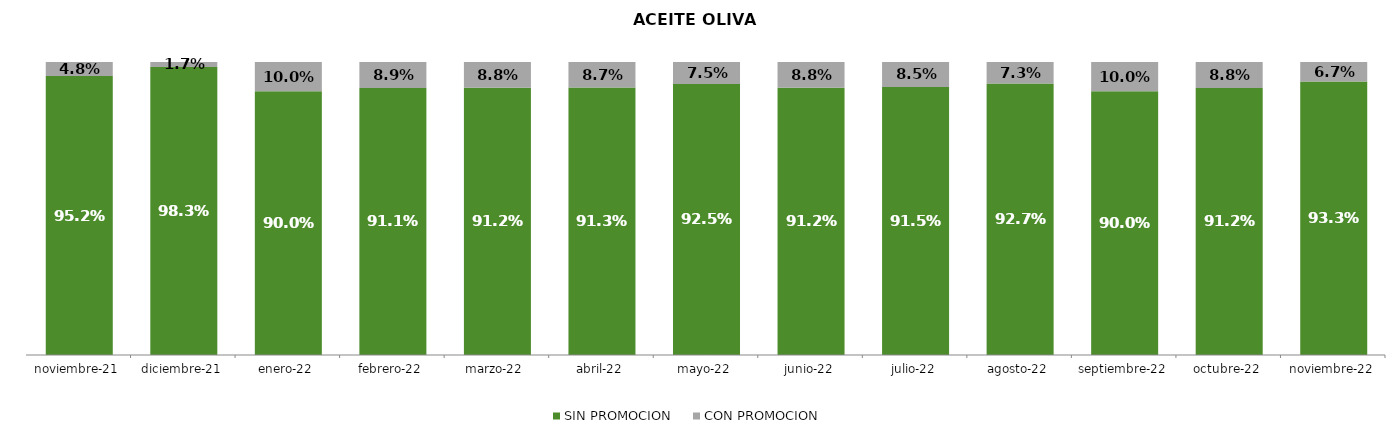
| Category | SIN PROMOCION   | CON PROMOCION   |
|---|---|---|
| 2021-11-01 | 0.952 | 0.048 |
| 2021-12-01 | 0.983 | 0.017 |
| 2022-01-01 | 0.9 | 0.1 |
| 2022-02-01 | 0.911 | 0.089 |
| 2022-03-01 | 0.912 | 0.088 |
| 2022-04-01 | 0.913 | 0.087 |
| 2022-05-01 | 0.925 | 0.075 |
| 2022-06-01 | 0.912 | 0.088 |
| 2022-07-01 | 0.915 | 0.085 |
| 2022-08-01 | 0.927 | 0.073 |
| 2022-09-01 | 0.9 | 0.1 |
| 2022-10-01 | 0.912 | 0.088 |
| 2022-11-01 | 0.933 | 0.067 |